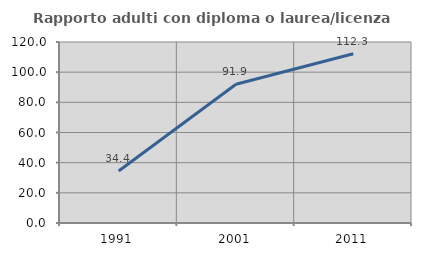
| Category | Rapporto adulti con diploma o laurea/licenza media  |
|---|---|
| 1991.0 | 34.423 |
| 2001.0 | 91.94 |
| 2011.0 | 112.254 |